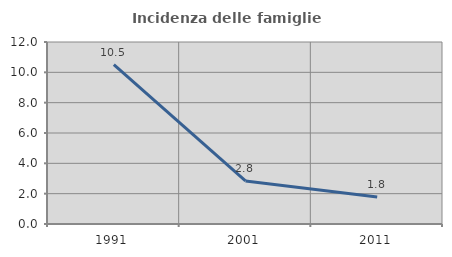
| Category | Incidenza delle famiglie numerose |
|---|---|
| 1991.0 | 10.51 |
| 2001.0 | 2.841 |
| 2011.0 | 1.786 |